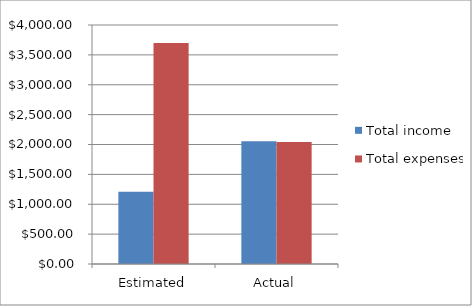
| Category | Total income | Total expenses |
|---|---|---|
| Estimated | 1210 | 3700 |
| Actual | 2056 | 2040 |